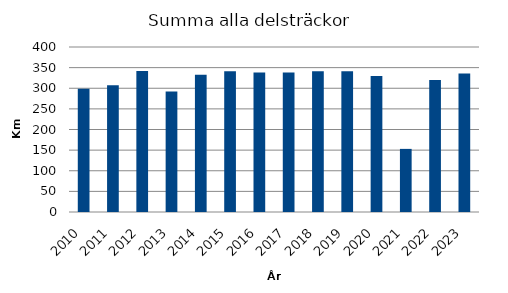
| Category | Series 0 |
|---|---|
| 2010.0 | 299 |
| 2011.0 | 307 |
| 2012.0 | 342 |
| 2013.0 | 292 |
| 2014.0 | 333 |
| 2015.0 | 341 |
| 2016.0 | 338 |
| 2017.0 | 338 |
| 2018.0 | 341 |
| 2019.0 | 341 |
| 2020.0 | 330 |
| 2021.0 | 153 |
| 2022.0 | 320 |
| 2023.0 | 336 |